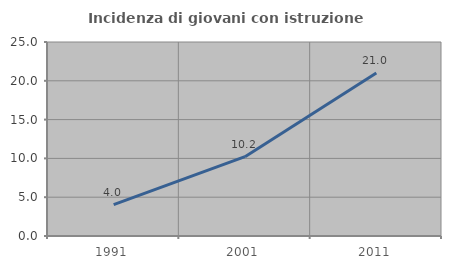
| Category | Incidenza di giovani con istruzione universitaria |
|---|---|
| 1991.0 | 4.04 |
| 2001.0 | 10.22 |
| 2011.0 | 21.012 |